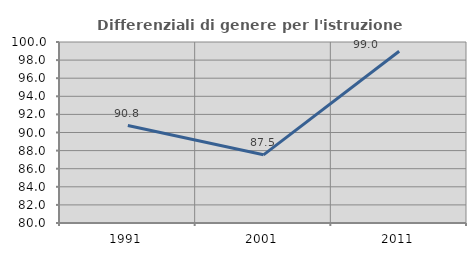
| Category | Differenziali di genere per l'istruzione superiore |
|---|---|
| 1991.0 | 90.765 |
| 2001.0 | 87.534 |
| 2011.0 | 98.985 |